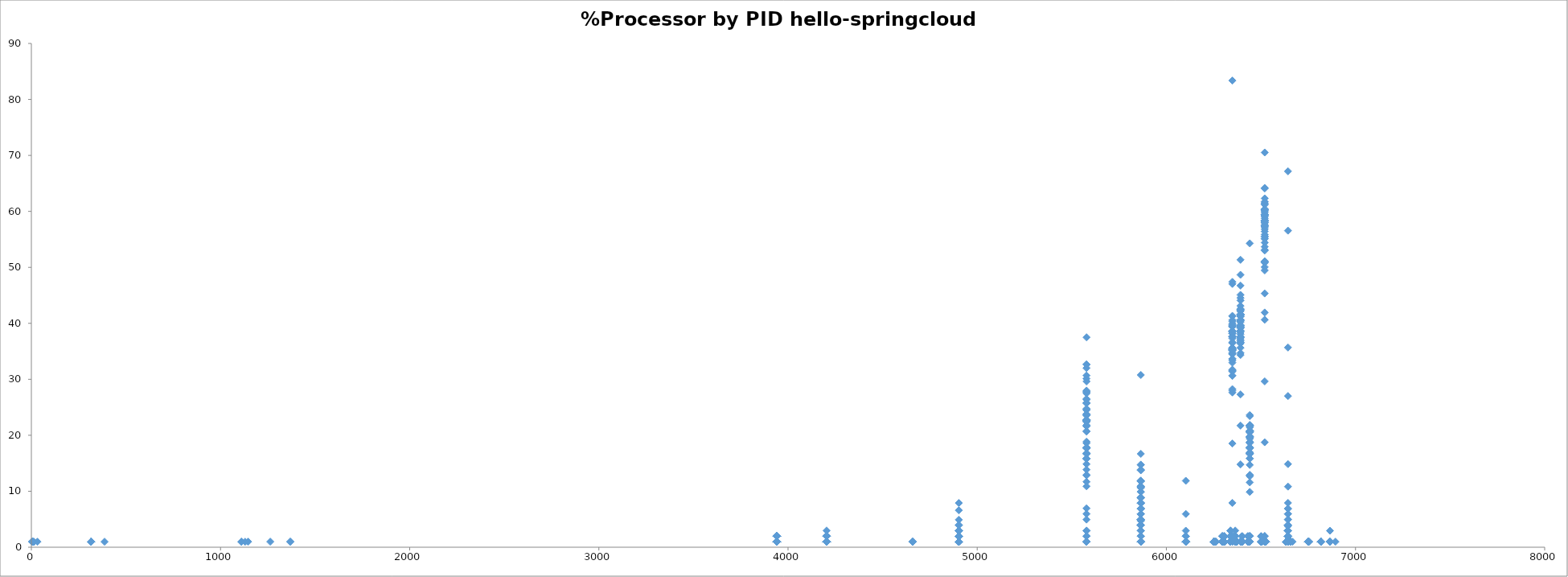
| Category | %CPU |
|---|---|
| 6865.0 | 2.95 |
| 6865.0 | 0.99 |
| 6865.0 | 0.99 |
| 3941.0 | 0.99 |
| 3941.0 | 0.99 |
| 3941.0 | 0.99 |
| 3941.0 | 0.99 |
| 3941.0 | 0.98 |
| 3941.0 | 0.99 |
| 3941.0 | 0.99 |
| 3941.0 | 0.96 |
| 3941.0 | 1.98 |
| 3941.0 | 0.98 |
| 3941.0 | 0.98 |
| 3941.0 | 0.98 |
| 3941.0 | 1.96 |
| 3941.0 | 0.98 |
| 3941.0 | 1.95 |
| 3941.0 | 1.98 |
| 3941.0 | 1.97 |
| 3941.0 | 0.98 |
| 3941.0 | 0.99 |
| 3941.0 | 0.99 |
| 3941.0 | 0.99 |
| 3941.0 | 1.98 |
| 3941.0 | 0.98 |
| 3941.0 | 0.99 |
| 3941.0 | 0.99 |
| 3941.0 | 1.96 |
| 3941.0 | 1.98 |
| 3941.0 | 1.97 |
| 3941.0 | 0.99 |
| 3941.0 | 1.97 |
| 3941.0 | 0.98 |
| 3941.0 | 1.98 |
| 3941.0 | 1.97 |
| 3941.0 | 0.97 |
| 3941.0 | 0.99 |
| 3941.0 | 1.97 |
| 3941.0 | 0.99 |
| 3941.0 | 0.99 |
| 3941.0 | 0.99 |
| 3941.0 | 0.98 |
| 3941.0 | 0.98 |
| 3941.0 | 1.98 |
| 3941.0 | 0.99 |
| 3941.0 | 1.97 |
| 3941.0 | 0.99 |
| 3941.0 | 1.94 |
| 3941.0 | 0.99 |
| 3941.0 | 1.98 |
| 3941.0 | 0.99 |
| 3941.0 | 0.99 |
| 3941.0 | 0.99 |
| 3941.0 | 0.99 |
| 3941.0 | 1.98 |
| 3941.0 | 0.99 |
| 3941.0 | 0.99 |
| 3941.0 | 1.98 |
| 3941.0 | 0.99 |
| 3941.0 | 0.99 |
| 3941.0 | 1.99 |
| 3941.0 | 0.99 |
| 3941.0 | 0.99 |
| 3941.0 | 1.99 |
| 3941.0 | 1.99 |
| 3941.0 | 0.99 |
| 3941.0 | 0.99 |
| 3941.0 | 0.99 |
| 3941.0 | 1.99 |
| 1130.0 | 0.98 |
| 6402.0 | 0.99 |
| 6402.0 | 0.99 |
| 6402.0 | 0.99 |
| 6402.0 | 0.98 |
| 6402.0 | 0.98 |
| 6306.0 | 0.98 |
| 6399.0 | 1.96 |
| 6306.0 | 0.98 |
| 6399.0 | 0.98 |
| 6402.0 | 0.98 |
| 6526.0 | 0.98 |
| 6306.0 | 0.98 |
| 6306.0 | 1.96 |
| 6399.0 | 0.98 |
| 6402.0 | 0.98 |
| 6399.0 | 0.98 |
| 6402.0 | 0.98 |
| 6306.0 | 0.99 |
| 6399.0 | 0.98 |
| 6402.0 | 0.98 |
| 6526.0 | 0.98 |
| 6306.0 | 0.98 |
| 6399.0 | 0.98 |
| 6402.0 | 0.98 |
| 6399.0 | 0.98 |
| 6667.0 | 0.98 |
| 6306.0 | 0.99 |
| 6306.0 | 0.99 |
| 6399.0 | 0.99 |
| 6402.0 | 0.99 |
| 6306.0 | 0.99 |
| 6399.0 | 0.99 |
| 6526.0 | 0.99 |
| 6402.0 | 0.99 |
| 6306.0 | 0.98 |
| 6399.0 | 0.98 |
| 6402.0 | 0.98 |
| 6306.0 | 0.99 |
| 6306.0 | 0.99 |
| 6399.0 | 0.99 |
| 6399.0 | 0.99 |
| 6402.0 | 0.99 |
| 6306.0 | 1.98 |
| 6399.0 | 0.99 |
| 6402.0 | 0.99 |
| 6399.0 | 0.99 |
| 6306.0 | 0.99 |
| 6399.0 | 0.99 |
| 6306.0 | 0.99 |
| 6402.0 | 0.99 |
| 6526.0 | 0.99 |
| 6306.0 | 0.99 |
| 6399.0 | 0.99 |
| 6402.0 | 0.99 |
| 6306.0 | 0.98 |
| 6399.0 | 0.98 |
| 6402.0 | 0.98 |
| 6526.0 | 0.98 |
| 6306.0 | 1.88 |
| 6399.0 | 0.94 |
| 6402.0 | 0.99 |
| 6306.0 | 0.99 |
| 6399.0 | 0.99 |
| 6402.0 | 0.99 |
| 6526.0 | 0.99 |
| 6306.0 | 0.97 |
| 6399.0 | 0.97 |
| 6306.0 | 0.99 |
| 6399.0 | 0.99 |
| 6402.0 | 0.99 |
| 6306.0 | 0.98 |
| 6399.0 | 0.98 |
| 6402.0 | 0.98 |
| 6306.0 | 0.98 |
| 6399.0 | 0.98 |
| 6399.0 | 0.99 |
| 6402.0 | 0.99 |
| 6306.0 | 0.99 |
| 6306.0 | 0.99 |
| 6399.0 | 0.99 |
| 6402.0 | 0.99 |
| 6399.0 | 0.98 |
| 6402.0 | 0.98 |
| 6306.0 | 0.98 |
| 6399.0 | 0.98 |
| 6526.0 | 0.98 |
| 6306.0 | 0.99 |
| 6399.0 | 0.99 |
| 6306.0 | 0.99 |
| 6399.0 | 0.99 |
| 6402.0 | 0.99 |
| 6402.0 | 0.98 |
| 6306.0 | 0.99 |
| 6399.0 | 0.99 |
| 6526.0 | 0.99 |
| 6306.0 | 1.98 |
| 6399.0 | 0.99 |
| 6402.0 | 0.99 |
| 6306.0 | 0.97 |
| 6399.0 | 0.97 |
| 6402.0 | 0.97 |
| 6306.0 | 0.99 |
| 6399.0 | 0.99 |
| 6402.0 | 0.99 |
| 6306.0 | 0.99 |
| 6399.0 | 0.99 |
| 6306.0 | 0.99 |
| 6399.0 | 0.99 |
| 6306.0 | 0.99 |
| 6399.0 | 0.99 |
| 6402.0 | 1.97 |
| 6526.0 | 0.99 |
| 6399.0 | 0.99 |
| 6402.0 | 0.99 |
| 6306.0 | 0.99 |
| 6261.0 | 0.99 |
| 6261.0 | 0.99 |
| 6261.0 | 0.99 |
| 1110.0 | 0.98 |
| 1111.0 | 0.99 |
| 5865.0 | 1.99 |
| 6643.0 | 0.99 |
| 4903.0 | 0.99 |
| 5578.0 | 0.99 |
| 5865.0 | 0.99 |
| 6349.0 | 0.99 |
| 6520.0 | 0.99 |
| 4903.0 | 0.99 |
| 5865.0 | 0.99 |
| 6349.0 | 39.73 |
| 6392.0 | 48.67 |
| 6441.0 | 12.91 |
| 6520.0 | 70.52 |
| 6643.0 | 4.97 |
| 4903.0 | 0.99 |
| 5578.0 | 4.94 |
| 5865.0 | 0.99 |
| 6349.0 | 47.4 |
| 6392.0 | 51.35 |
| 6441.0 | 16.79 |
| 6520.0 | 64.19 |
| 6643.0 | 6.91 |
| 4903.0 | 1.96 |
| 5578.0 | 2.94 |
| 5865.0 | 10.78 |
| 6349.0 | 47.04 |
| 6392.0 | 45.08 |
| 6441.0 | 18.62 |
| 6520.0 | 61.74 |
| 6643.0 | 3.92 |
| 4903.0 | 1.98 |
| 5578.0 | 14.85 |
| 5865.0 | 10.89 |
| 6349.0 | 38.6 |
| 6392.0 | 39.59 |
| 6441.0 | 15.84 |
| 6520.0 | 56.41 |
| 6643.0 | 14.85 |
| 4903.0 | 1.98 |
| 5578.0 | 23.79 |
| 5865.0 | 9.91 |
| 6349.0 | 31.72 |
| 6392.0 | 34.69 |
| 6441.0 | 12.89 |
| 6520.0 | 40.64 |
| 6643.0 | 35.68 |
| 4903.0 | 1.93 |
| 5578.0 | 27.98 |
| 5865.0 | 10.61 |
| 6349.0 | 27.98 |
| 6392.0 | 37.62 |
| 6441.0 | 11.58 |
| 6520.0 | 45.34 |
| 6643.0 | 27.01 |
| 4903.0 | 2.98 |
| 5578.0 | 25.8 |
| 5865.0 | 10.91 |
| 6349.0 | 37.7 |
| 6392.0 | 38.69 |
| 6441.0 | 15.87 |
| 6520.0 | 55.56 |
| 6643.0 | 1.98 |
| 4659.0 | 0.98 |
| 4903.0 | 4.91 |
| 5578.0 | 17.67 |
| 5865.0 | 13.74 |
| 6349.0 | 37.3 |
| 6392.0 | 41.23 |
| 6441.0 | 16.69 |
| 6520.0 | 53.01 |
| 6643.0 | 6.87 |
| 4903.0 | 1.96 |
| 5578.0 | 16.66 |
| 5865.0 | 14.7 |
| 6349.0 | 38.21 |
| 6392.0 | 44.09 |
| 6441.0 | 19.6 |
| 6520.0 | 50.95 |
| 6643.0 | 3.92 |
| 4903.0 | 1.96 |
| 5578.0 | 22.6 |
| 5865.0 | 7.86 |
| 6349.0 | 41.26 |
| 6392.0 | 41.26 |
| 6441.0 | 19.65 |
| 6520.0 | 51.09 |
| 6643.0 | 1.96 |
| 4903.0 | 1.96 |
| 5578.0 | 26.5 |
| 5865.0 | 8.83 |
| 6349.0 | 35.33 |
| 6392.0 | 40.24 |
| 6441.0 | 17.67 |
| 6520.0 | 51.03 |
| 6643.0 | 3.93 |
| 4903.0 | 0.98 |
| 5578.0 | 16.73 |
| 5865.0 | 13.78 |
| 6349.0 | 41.33 |
| 6392.0 | 37.39 |
| 6441.0 | 19.68 |
| 6520.0 | 55.1 |
| 6643.0 | 1.97 |
| 4903.0 | 1.96 |
| 5578.0 | 27.48 |
| 5865.0 | 16.68 |
| 6349.0 | 31.4 |
| 6392.0 | 34.35 |
| 6441.0 | 20.61 |
| 6520.0 | 50.05 |
| 6643.0 | 2.94 |
| 4903.0 | 0.98 |
| 5578.0 | 22.45 |
| 5865.0 | 10.74 |
| 6349.0 | 35.14 |
| 6392.0 | 37.09 |
| 6441.0 | 20.5 |
| 6520.0 | 53.68 |
| 6643.0 | 0.98 |
| 4659.0 | 0.98 |
| 4903.0 | 1.97 |
| 5578.0 | 17.71 |
| 5865.0 | 14.76 |
| 6349.0 | 35.42 |
| 6392.0 | 36.4 |
| 6441.0 | 23.61 |
| 6520.0 | 53.13 |
| 6643.0 | 2.95 |
| 4903.0 | 2.97 |
| 5578.0 | 15.83 |
| 5865.0 | 7.91 |
| 6349.0 | 37.59 |
| 6392.0 | 36.6 |
| 6441.0 | 20.77 |
| 6520.0 | 60.33 |
| 6643.0 | 7.91 |
| 4903.0 | 3.94 |
| 5578.0 | 22.64 |
| 5865.0 | 7.87 |
| 6349.0 | 31.5 |
| 6392.0 | 39.37 |
| 6441.0 | 21.65 |
| 6520.0 | 55.12 |
| 6643.0 | 4.92 |
| 4903.0 | 1.97 |
| 5578.0 | 16.73 |
| 5865.0 | 7.87 |
| 6349.0 | 40.34 |
| 6392.0 | 39.35 |
| 6441.0 | 21.64 |
| 6520.0 | 58.05 |
| 6643.0 | 1.97 |
| 4903.0 | 0.98 |
| 5578.0 | 26.36 |
| 5865.0 | 4.88 |
| 6349.0 | 35.15 |
| 6392.0 | 38.07 |
| 6441.0 | 23.43 |
| 6520.0 | 57.6 |
| 6643.0 | 1.95 |
| 4903.0 | 1.97 |
| 5578.0 | 23.65 |
| 5865.0 | 6.9 |
| 6349.0 | 39.42 |
| 6392.0 | 37.45 |
| 6441.0 | 16.75 |
| 6520.0 | 60.12 |
| 6643.0 | 0.99 |
| 4903.0 | 1.98 |
| 5578.0 | 32.65 |
| 5865.0 | 11.87 |
| 6349.0 | 30.67 |
| 6392.0 | 37.59 |
| 6441.0 | 17.81 |
| 6520.0 | 49.46 |
| 6643.0 | 3.96 |
| 4903.0 | 0.99 |
| 5578.0 | 32.66 |
| 5865.0 | 7.92 |
| 6349.0 | 34.64 |
| 6392.0 | 35.63 |
| 6441.0 | 19.79 |
| 6520.0 | 55.42 |
| 6643.0 | 0.99 |
| 4903.0 | 2.97 |
| 5578.0 | 15.85 |
| 5865.0 | 11.89 |
| 6349.0 | 37.65 |
| 6392.0 | 40.62 |
| 6441.0 | 20.8 |
| 6520.0 | 59.44 |
| 6643.0 | 2.97 |
| 4903.0 | 1.96 |
| 5578.0 | 18.6 |
| 5865.0 | 6.85 |
| 6349.0 | 38.19 |
| 6392.0 | 39.17 |
| 6441.0 | 20.56 |
| 6520.0 | 58.75 |
| 6643.0 | 1.96 |
| 4903.0 | 1.98 |
| 5578.0 | 21.81 |
| 5865.0 | 4.96 |
| 6349.0 | 37.67 |
| 6392.0 | 41.63 |
| 6441.0 | 21.81 |
| 6520.0 | 59.47 |
| 6643.0 | 1.98 |
| 4903.0 | 1.97 |
| 5578.0 | 29.62 |
| 5865.0 | 4.94 |
| 6349.0 | 31.6 |
| 6392.0 | 37.52 |
| 6441.0 | 18.76 |
| 6520.0 | 58.26 |
| 6643.0 | 2.96 |
| 4903.0 | 0.98 |
| 5578.0 | 23.53 |
| 5865.0 | 2.94 |
| 6349.0 | 35.3 |
| 6392.0 | 42.16 |
| 6441.0 | 20.59 |
| 6520.0 | 59.81 |
| 6643.0 | 1.96 |
| 4903.0 | 1.98 |
| 5578.0 | 25.73 |
| 5865.0 | 6.93 |
| 6349.0 | 33.65 |
| 6392.0 | 40.58 |
| 6441.0 | 19.79 |
| 6520.0 | 59.38 |
| 6643.0 | 0.99 |
| 4903.0 | 1.98 |
| 5578.0 | 24.74 |
| 5865.0 | 3.96 |
| 6349.0 | 35.62 |
| 6392.0 | 41.56 |
| 6441.0 | 18.8 |
| 6520.0 | 59.37 |
| 6643.0 | 2.97 |
| 4903.0 | 0.99 |
| 5578.0 | 18.85 |
| 5865.0 | 5.95 |
| 6349.0 | 34.72 |
| 6392.0 | 39.69 |
| 6441.0 | 21.83 |
| 6520.0 | 61.51 |
| 6643.0 | 5.95 |
| 4903.0 | 0.99 |
| 5578.0 | 12.83 |
| 5865.0 | 8.88 |
| 6349.0 | 38.5 |
| 6392.0 | 39.49 |
| 6441.0 | 21.72 |
| 6520.0 | 59.23 |
| 6643.0 | 1.97 |
| 4903.0 | 1.98 |
| 5578.0 | 15.84 |
| 5865.0 | 4.95 |
| 6349.0 | 40.59 |
| 6392.0 | 40.59 |
| 6441.0 | 21.78 |
| 6520.0 | 60.39 |
| 6643.0 | 2.97 |
| 4903.0 | 0.99 |
| 5578.0 | 17.79 |
| 5865.0 | 7.91 |
| 6349.0 | 38.56 |
| 6392.0 | 42.51 |
| 6441.0 | 20.76 |
| 6520.0 | 58.33 |
| 6643.0 | 1.98 |
| 4903.0 | 0.99 |
| 5578.0 | 22.7 |
| 5865.0 | 3.95 |
| 6349.0 | 34.54 |
| 6392.0 | 41.45 |
| 6441.0 | 20.73 |
| 6520.0 | 61.19 |
| 6643.0 | 1.97 |
| 4903.0 | 2.95 |
| 5578.0 | 24.62 |
| 5865.0 | 5.91 |
| 6349.0 | 35.45 |
| 6392.0 | 38.4 |
| 6441.0 | 21.66 |
| 6520.0 | 59.08 |
| 6643.0 | 10.83 |
| 4903.0 | 6.59 |
| 5578.0 | 30.12 |
| 5865.0 | 4.71 |
| 6349.0 | 28.24 |
| 6392.0 | 38.59 |
| 6441.0 | 16.94 |
| 6520.0 | 50.83 |
| 6643.0 | 3.76 |
| 4903.0 | 1.98 |
| 5578.0 | 22.77 |
| 5865.0 | 4.95 |
| 6349.0 | 33.66 |
| 6392.0 | 44.54 |
| 6441.0 | 17.82 |
| 6520.0 | 59.39 |
| 6643.0 | 0.99 |
| 4903.0 | 1.97 |
| 5578.0 | 15.78 |
| 5865.0 | 5.92 |
| 6349.0 | 36.49 |
| 6392.0 | 41.42 |
| 6441.0 | 20.71 |
| 6520.0 | 64.1 |
| 6643.0 | 1.97 |
| 4903.0 | 0.97 |
| 5578.0 | 11.69 |
| 5865.0 | 3.9 |
| 6349.0 | 39.93 |
| 6392.0 | 46.74 |
| 6441.0 | 21.42 |
| 6520.0 | 62.32 |
| 6643.0 | 1.95 |
| 4903.0 | 2.97 |
| 5578.0 | 23.75 |
| 5865.0 | 4.95 |
| 6349.0 | 37.6 |
| 6392.0 | 41.56 |
| 6441.0 | 17.81 |
| 6520.0 | 57.39 |
| 6643.0 | 1.98 |
| 4903.0 | 1.97 |
| 5578.0 | 21.68 |
| 5865.0 | 8.87 |
| 6349.0 | 34.48 |
| 6392.0 | 40.4 |
| 6441.0 | 17.73 |
| 6520.0 | 60.1 |
| 6643.0 | 0.99 |
| 4903.0 | 0.98 |
| 5578.0 | 20.67 |
| 5865.0 | 6.89 |
| 6349.0 | 39.37 |
| 6392.0 | 42.33 |
| 6441.0 | 19.69 |
| 6520.0 | 58.07 |
| 6643.0 | 1.97 |
| 4903.0 | 1.96 |
| 5578.0 | 21.61 |
| 5865.0 | 11.79 |
| 6349.0 | 33.39 |
| 6392.0 | 41.25 |
| 6441.0 | 16.7 |
| 6520.0 | 57.95 |
| 6643.0 | 0.98 |
| 4903.0 | 1.97 |
| 5578.0 | 17.77 |
| 5865.0 | 8.89 |
| 6349.0 | 39.49 |
| 6392.0 | 42.45 |
| 6441.0 | 17.77 |
| 6520.0 | 58.25 |
| 6643.0 | 2.96 |
| 4903.0 | 1.98 |
| 5578.0 | 17.81 |
| 5865.0 | 8.91 |
| 6349.0 | 39.58 |
| 6392.0 | 41.56 |
| 6441.0 | 18.8 |
| 6520.0 | 58.39 |
| 6643.0 | 1.98 |
| 4659.0 | 0.99 |
| 4903.0 | 0.99 |
| 5578.0 | 22.76 |
| 5865.0 | 10.89 |
| 6349.0 | 33.65 |
| 6392.0 | 41.56 |
| 6441.0 | 16.82 |
| 6520.0 | 57.4 |
| 6643.0 | 2.97 |
| 4903.0 | 0.98 |
| 5578.0 | 22.54 |
| 5865.0 | 11.76 |
| 6349.0 | 35.28 |
| 6392.0 | 39.2 |
| 6441.0 | 16.66 |
| 6520.0 | 56.83 |
| 6643.0 | 3.92 |
| 4903.0 | 0.98 |
| 5578.0 | 24.5 |
| 5865.0 | 4.9 |
| 6349.0 | 38.22 |
| 6392.0 | 43.12 |
| 6441.0 | 14.7 |
| 6520.0 | 55.86 |
| 6643.0 | 3.92 |
| 4903.0 | 1.98 |
| 5578.0 | 25.73 |
| 5865.0 | 3.96 |
| 6349.0 | 38.59 |
| 6392.0 | 39.58 |
| 6441.0 | 17.81 |
| 6520.0 | 59.37 |
| 6643.0 | 2.97 |
| 4903.0 | 2.96 |
| 5578.0 | 20.74 |
| 5865.0 | 6.91 |
| 6349.0 | 30.62 |
| 6392.0 | 21.73 |
| 6441.0 | 9.88 |
| 6520.0 | 29.63 |
| 6643.0 | 67.16 |
| 4903.0 | 0.98 |
| 5578.0 | 22.43 |
| 5865.0 | 8.78 |
| 6349.0 | 18.53 |
| 6392.0 | 27.3 |
| 6441.0 | 12.68 |
| 6520.0 | 41.93 |
| 6643.0 | 56.56 |
| 4903.0 | 1.97 |
| 5578.0 | 22.69 |
| 5865.0 | 7.89 |
| 6349.0 | 36.5 |
| 6392.0 | 40.45 |
| 6441.0 | 20.72 |
| 6520.0 | 57.22 |
| 6643.0 | 2.96 |
| 4903.0 | 0.99 |
| 5578.0 | 10.89 |
| 5865.0 | 11.88 |
| 6349.0 | 38.6 |
| 6392.0 | 40.58 |
| 6441.0 | 19.79 |
| 6520.0 | 61.36 |
| 6643.0 | 1.98 |
| 4659.0 | 0.99 |
| 4903.0 | 0.99 |
| 5578.0 | 22.77 |
| 5865.0 | 9.9 |
| 6349.0 | 36.62 |
| 6392.0 | 38.6 |
| 6441.0 | 16.83 |
| 6520.0 | 59.39 |
| 6643.0 | 5.94 |
| 4903.0 | 1.94 |
| 5578.0 | 32.01 |
| 5865.0 | 4.85 |
| 6349.0 | 32.98 |
| 6392.0 | 36.86 |
| 6441.0 | 19.4 |
| 6520.0 | 57.23 |
| 6643.0 | 1.94 |
| 4903.0 | 0.99 |
| 5578.0 | 27.71 |
| 5865.0 | 3.96 |
| 6349.0 | 35.62 |
| 6392.0 | 36.61 |
| 6441.0 | 20.78 |
| 6520.0 | 54.42 |
| 6643.0 | 1.98 |
| 4903.0 | 0.99 |
| 5578.0 | 16.81 |
| 5865.0 | 3.96 |
| 6349.0 | 38.57 |
| 6392.0 | 39.56 |
| 6441.0 | 16.81 |
| 6520.0 | 60.32 |
| 6643.0 | 0.99 |
| 4903.0 | 0.99 |
| 5578.0 | 17.82 |
| 5865.0 | 4.95 |
| 6349.0 | 38.61 |
| 6392.0 | 42.57 |
| 6441.0 | 20.79 |
| 6520.0 | 58.41 |
| 6643.0 | 3.96 |
| 4903.0 | 2.97 |
| 5578.0 | 13.86 |
| 5865.0 | 13.86 |
| 6349.0 | 35.65 |
| 6392.0 | 41.59 |
| 6441.0 | 17.82 |
| 6520.0 | 60.4 |
| 6643.0 | 1.98 |
| 4903.0 | 7.9 |
| 5578.0 | 37.5 |
| 5865.0 | 4.93 |
| 6349.0 | 27.64 |
| 6392.0 | 14.8 |
| 6441.0 | 54.28 |
| 6520.0 | 18.75 |
| 4903.0 | 1.98 |
| 5578.0 | 27.79 |
| 5865.0 | 30.77 |
| 6349.0 | 83.37 |
| 6643.0 | 0.99 |
| 4903.0 | 3.96 |
| 5578.0 | 30.68 |
| 5865.0 | 3.96 |
| 6349.0 | 7.92 |
| 6520.0 | 0.99 |
| 6643.0 | 0.99 |
| 4903.0 | 0.99 |
| 5578.0 | 2.97 |
| 5865.0 | 1.98 |
| 4903.0 | 1.99 |
| 5865.0 | 0.99 |
| 6349.0 | 0.99 |
| 6441.0 | 0.99 |
| 6520.0 | 0.99 |
| 6643.0 | 0.99 |
| 5578.0 | 1.99 |
| 5865.0 | 0.99 |
| 6392.0 | 0.99 |
| 6520.0 | 1.99 |
| 6643.0 | 1.99 |
| 4903.0 | 1.98 |
| 5578.0 | 1.98 |
| 5865.0 | 0.99 |
| 6441.0 | 1.98 |
| 6520.0 | 0.99 |
| 4903.0 | 0.99 |
| 5865.0 | 2.98 |
| 6392.0 | 0.99 |
| 6441.0 | 0.99 |
| 6520.0 | 1.99 |
| 6643.0 | 1.99 |
| 5578.0 | 0.99 |
| 5865.0 | 1.99 |
| 6349.0 | 0.99 |
| 6643.0 | 0.99 |
| 4903.0 | 1.99 |
| 5865.0 | 0.99 |
| 6441.0 | 1.99 |
| 6520.0 | 0.99 |
| 6643.0 | 1.99 |
| 4903.0 | 1.99 |
| 5578.0 | 0.99 |
| 5865.0 | 0.99 |
| 6520.0 | 0.99 |
| 6643.0 | 0.99 |
| 4903.0 | 0.99 |
| 5865.0 | 0.99 |
| 6349.0 | 0.99 |
| 6441.0 | 0.99 |
| 6520.0 | 0.99 |
| 4903.0 | 0.99 |
| 5578.0 | 0.99 |
| 5865.0 | 2.98 |
| 6643.0 | 0.99 |
| 4903.0 | 1.99 |
| 5578.0 | 0.99 |
| 5865.0 | 0.99 |
| 6392.0 | 0.99 |
| 6441.0 | 0.99 |
| 4903.0 | 1.99 |
| 5865.0 | 0.99 |
| 6520.0 | 0.99 |
| 6643.0 | 0.99 |
| 5578.0 | 12.92 |
| 5865.0 | 0.99 |
| 6349.0 | 1.99 |
| 6441.0 | 0.99 |
| 6643.0 | 0.99 |
| 4903.0 | 1.99 |
| 5578.0 | 6.95 |
| 5865.0 | 0.99 |
| 6392.0 | 0.99 |
| 6441.0 | 0.99 |
| 6520.0 | 0.99 |
| 6643.0 | 0.99 |
| 4903.0 | 0.99 |
| 5578.0 | 5.96 |
| 5865.0 | 3.97 |
| 6441.0 | 1.99 |
| 6520.0 | 0.99 |
| 6643.0 | 0.99 |
| 316.0 | 0.99 |
| 316.0 | 0.98 |
| 316.0 | 0.99 |
| 316.0 | 0.98 |
| 316.0 | 0.98 |
| 316.0 | 0.99 |
| 316.0 | 0.99 |
| 316.0 | 0.97 |
| 3.0 | 0.99 |
| 13.0 | 0.98 |
| 13.0 | 0.94 |
| 1369.0 | 0.99 |
| 1369.0 | 0.99 |
| 32.0 | 0.98 |
| 6755.0 | 0.99 |
| 6751.0 | 0.99 |
| 6751.0 | 0.99 |
| 6751.0 | 0.98 |
| 6751.0 | 0.99 |
| 6751.0 | 0.98 |
| 6751.0 | 0.98 |
| 6751.0 | 0.98 |
| 6751.0 | 0.98 |
| 6751.0 | 0.99 |
| 6751.0 | 0.98 |
| 6751.0 | 0.98 |
| 6751.0 | 0.99 |
| 6751.0 | 0.98 |
| 6751.0 | 0.99 |
| 6751.0 | 0.99 |
| 6751.0 | 0.99 |
| 6751.0 | 0.99 |
| 6751.0 | 0.99 |
| 6751.0 | 0.98 |
| 6751.0 | 0.94 |
| 6751.0 | 0.99 |
| 6751.0 | 0.99 |
| 6751.0 | 0.98 |
| 6751.0 | 0.99 |
| 6751.0 | 0.98 |
| 6751.0 | 0.99 |
| 6751.0 | 0.99 |
| 6751.0 | 0.99 |
| 6751.0 | 0.97 |
| 6751.0 | 0.99 |
| 6751.0 | 0.99 |
| 6751.0 | 0.99 |
| 6751.0 | 0.99 |
| 6751.0 | 0.99 |
| 6751.0 | 0.99 |
| 6751.0 | 0.99 |
| 6751.0 | 0.99 |
| 6751.0 | 0.99 |
| 6751.0 | 0.99 |
| 6103.0 | 0.99 |
| 6103.0 | 0.99 |
| 6103.0 | 0.99 |
| 6103.0 | 1.98 |
| 6103.0 | 0.98 |
| 6103.0 | 0.98 |
| 6103.0 | 2.95 |
| 6103.0 | 0.99 |
| 6103.0 | 0.99 |
| 6103.0 | 0.98 |
| 6103.0 | 0.99 |
| 6103.0 | 0.98 |
| 6103.0 | 0.99 |
| 6103.0 | 0.99 |
| 6103.0 | 0.99 |
| 6103.0 | 0.94 |
| 6103.0 | 0.97 |
| 6103.0 | 1.97 |
| 6103.0 | 1.98 |
| 6103.0 | 0.99 |
| 6103.0 | 0.99 |
| 6103.0 | 5.94 |
| 6103.0 | 11.87 |
| 6103.0 | 0.99 |
| 6103.0 | 0.99 |
| 6103.0 | 0.99 |
| 6103.0 | 0.99 |
| 6103.0 | 0.99 |
| 6103.0 | 0.99 |
| 6103.0 | 0.99 |
| 6251.0 | 0.99 |
| 6371.0 | 0.99 |
| 6372.0 | 0.99 |
| 6431.0 | 0.99 |
| 4204.0 | 2.98 |
| 6251.0 | 0.99 |
| 6364.0 | 0.99 |
| 6633.0 | 0.99 |
| 6656.0 | 0.99 |
| 6296.0 | 0.99 |
| 6339.0 | 0.99 |
| 6501.0 | 1.99 |
| 6505.0 | 0.99 |
| 4204.0 | 0.99 |
| 6339.0 | 0.99 |
| 6364.0 | 0.99 |
| 4204.0 | 0.98 |
| 6251.0 | 0.98 |
| 6339.0 | 0.98 |
| 6364.0 | 0.98 |
| 6371.0 | 0.98 |
| 6372.0 | 0.98 |
| 6431.0 | 0.98 |
| 6656.0 | 0.98 |
| 4204.0 | 0.99 |
| 6296.0 | 0.99 |
| 6364.0 | 0.99 |
| 6501.0 | 0.99 |
| 6633.0 | 0.99 |
| 4204.0 | 0.99 |
| 6339.0 | 0.99 |
| 6364.0 | 0.99 |
| 6371.0 | 0.99 |
| 4204.0 | 0.96 |
| 6339.0 | 0.96 |
| 6364.0 | 0.96 |
| 6505.0 | 0.96 |
| 4204.0 | 0.99 |
| 6251.0 | 0.99 |
| 6339.0 | 0.99 |
| 6364.0 | 0.99 |
| 6656.0 | 0.99 |
| 6339.0 | 0.98 |
| 6364.0 | 0.98 |
| 6371.0 | 0.98 |
| 6431.0 | 1.96 |
| 6633.0 | 0.98 |
| 4204.0 | 0.98 |
| 6296.0 | 0.98 |
| 6339.0 | 1.96 |
| 6364.0 | 0.98 |
| 6372.0 | 0.98 |
| 6501.0 | 0.98 |
| 4204.0 | 1.96 |
| 6251.0 | 0.98 |
| 6339.0 | 0.98 |
| 6364.0 | 0.98 |
| 6501.0 | 0.98 |
| 4204.0 | 0.98 |
| 6296.0 | 0.98 |
| 6339.0 | 0.98 |
| 6364.0 | 0.98 |
| 6371.0 | 0.98 |
| 6431.0 | 0.98 |
| 6505.0 | 0.98 |
| 6633.0 | 0.98 |
| 4204.0 | 1.97 |
| 6339.0 | 1.97 |
| 6364.0 | 1.97 |
| 6501.0 | 0.98 |
| 6505.0 | 0.98 |
| 6656.0 | 0.98 |
| 6339.0 | 0.98 |
| 6364.0 | 1.96 |
| 6431.0 | 0.98 |
| 6656.0 | 0.98 |
| 4204.0 | 0.98 |
| 6251.0 | 0.98 |
| 6339.0 | 0.98 |
| 6364.0 | 0.98 |
| 6372.0 | 0.98 |
| 6431.0 | 0.98 |
| 6501.0 | 0.98 |
| 6339.0 | 0.98 |
| 6364.0 | 1.97 |
| 6633.0 | 0.98 |
| 4204.0 | 0.99 |
| 6296.0 | 0.99 |
| 6339.0 | 1.98 |
| 6371.0 | 0.99 |
| 6431.0 | 0.99 |
| 6501.0 | 0.99 |
| 6505.0 | 0.99 |
| 4204.0 | 0.98 |
| 6251.0 | 0.98 |
| 6339.0 | 0.98 |
| 6364.0 | 1.97 |
| 6372.0 | 0.98 |
| 6656.0 | 0.98 |
| 4204.0 | 0.98 |
| 6339.0 | 0.98 |
| 6364.0 | 1.97 |
| 6371.0 | 0.98 |
| 6431.0 | 0.98 |
| 4204.0 | 0.98 |
| 6339.0 | 1.95 |
| 6431.0 | 0.98 |
| 6501.0 | 0.98 |
| 6656.0 | 0.98 |
| 6251.0 | 0.99 |
| 6339.0 | 1.97 |
| 6364.0 | 1.97 |
| 6431.0 | 0.99 |
| 6633.0 | 0.99 |
| 4204.0 | 1.98 |
| 6296.0 | 1.98 |
| 6339.0 | 0.99 |
| 6364.0 | 1.98 |
| 6505.0 | 0.99 |
| 4204.0 | 0.99 |
| 6251.0 | 0.99 |
| 6339.0 | 0.99 |
| 6364.0 | 0.99 |
| 6371.0 | 0.99 |
| 6501.0 | 0.99 |
| 6633.0 | 0.99 |
| 4204.0 | 0.99 |
| 6339.0 | 1.98 |
| 6364.0 | 0.99 |
| 6372.0 | 0.99 |
| 6431.0 | 0.99 |
| 4204.0 | 0.98 |
| 6339.0 | 0.98 |
| 6364.0 | 0.98 |
| 6656.0 | 0.98 |
| 4204.0 | 0.99 |
| 6251.0 | 0.99 |
| 6339.0 | 0.99 |
| 6364.0 | 1.98 |
| 6431.0 | 0.99 |
| 6501.0 | 0.99 |
| 4204.0 | 0.99 |
| 6296.0 | 0.99 |
| 6339.0 | 0.99 |
| 6364.0 | 0.99 |
| 6371.0 | 0.99 |
| 6372.0 | 0.99 |
| 6501.0 | 0.99 |
| 6505.0 | 0.99 |
| 6296.0 | 0.98 |
| 6339.0 | 1.96 |
| 6364.0 | 1.96 |
| 6431.0 | 0.98 |
| 6251.0 | 0.99 |
| 6339.0 | 1.98 |
| 6364.0 | 0.99 |
| 6371.0 | 0.99 |
| 6372.0 | 0.99 |
| 6431.0 | 0.99 |
| 6656.0 | 0.99 |
| 4204.0 | 0.99 |
| 6296.0 | 0.99 |
| 6339.0 | 0.99 |
| 6364.0 | 1.98 |
| 6501.0 | 0.99 |
| 6633.0 | 0.99 |
| 4204.0 | 0.99 |
| 6339.0 | 1.98 |
| 6364.0 | 0.99 |
| 4204.0 | 1.97 |
| 6364.0 | 0.99 |
| 6431.0 | 0.99 |
| 6501.0 | 0.99 |
| 6505.0 | 0.99 |
| 6339.0 | 2.97 |
| 6364.0 | 1.98 |
| 6372.0 | 0.99 |
| 6431.0 | 0.99 |
| 4204.0 | 1.98 |
| 6339.0 | 0.99 |
| 6364.0 | 1.98 |
| 6371.0 | 0.99 |
| 6501.0 | 0.99 |
| 6633.0 | 0.99 |
| 6656.0 | 0.99 |
| 4204.0 | 0.99 |
| 6251.0 | 0.99 |
| 6339.0 | 0.99 |
| 6364.0 | 1.97 |
| 6431.0 | 0.99 |
| 6505.0 | 0.99 |
| 6339.0 | 0.98 |
| 6364.0 | 0.98 |
| 6371.0 | 0.98 |
| 6431.0 | 0.98 |
| 6633.0 | 0.98 |
| 4204.0 | 0.94 |
| 6251.0 | 0.94 |
| 6296.0 | 0.94 |
| 6339.0 | 1.88 |
| 6364.0 | 0.94 |
| 6501.0 | 0.94 |
| 6656.0 | 0.94 |
| 4204.0 | 1.98 |
| 6251.0 | 0.99 |
| 6296.0 | 0.99 |
| 6339.0 | 1.98 |
| 6364.0 | 1.98 |
| 6372.0 | 0.99 |
| 6431.0 | 0.99 |
| 6501.0 | 0.99 |
| 6505.0 | 0.99 |
| 6364.0 | 1.97 |
| 6371.0 | 0.99 |
| 6372.0 | 0.99 |
| 6633.0 | 0.99 |
| 6656.0 | 0.99 |
| 6251.0 | 0.97 |
| 6339.0 | 2.92 |
| 6364.0 | 1.95 |
| 6431.0 | 1.95 |
| 6501.0 | 0.97 |
| 4204.0 | 0.99 |
| 6501.0 | 0.99 |
| 6633.0 | 0.99 |
| 4204.0 | 0.99 |
| 6296.0 | 0.99 |
| 6339.0 | 1.97 |
| 6364.0 | 1.97 |
| 6371.0 | 0.99 |
| 6431.0 | 0.99 |
| 6505.0 | 0.99 |
| 4204.0 | 0.98 |
| 6339.0 | 1.97 |
| 6364.0 | 1.97 |
| 6431.0 | 0.98 |
| 6501.0 | 0.98 |
| 4204.0 | 0.98 |
| 6339.0 | 1.96 |
| 6364.0 | 1.96 |
| 6656.0 | 0.98 |
| 4204.0 | 0.99 |
| 6251.0 | 0.99 |
| 6339.0 | 0.99 |
| 6364.0 | 0.99 |
| 6372.0 | 0.99 |
| 4204.0 | 0.99 |
| 6339.0 | 0.99 |
| 6364.0 | 1.98 |
| 6431.0 | 0.99 |
| 6501.0 | 0.99 |
| 6505.0 | 0.99 |
| 6633.0 | 0.99 |
| 6296.0 | 1.98 |
| 6339.0 | 1.98 |
| 6364.0 | 0.99 |
| 4204.0 | 0.98 |
| 6251.0 | 0.98 |
| 6339.0 | 1.96 |
| 6364.0 | 1.96 |
| 6431.0 | 0.98 |
| 6501.0 | 0.98 |
| 6656.0 | 0.98 |
| 4204.0 | 0.98 |
| 6339.0 | 1.96 |
| 6364.0 | 1.96 |
| 6371.0 | 0.98 |
| 6431.0 | 0.98 |
| 6633.0 | 0.98 |
| 4204.0 | 0.99 |
| 6339.0 | 1.98 |
| 6364.0 | 0.99 |
| 6372.0 | 0.99 |
| 6501.0 | 0.99 |
| 4204.0 | 0.99 |
| 6296.0 | 0.99 |
| 6364.0 | 0.99 |
| 6371.0 | 0.99 |
| 6505.0 | 0.99 |
| 6339.0 | 0.98 |
| 6364.0 | 0.98 |
| 4204.0 | 1.97 |
| 6251.0 | 0.99 |
| 6339.0 | 1.97 |
| 6364.0 | 1.97 |
| 6372.0 | 0.99 |
| 6431.0 | 1.97 |
| 6656.0 | 0.99 |
| 4204.0 | 0.99 |
| 6339.0 | 0.99 |
| 6364.0 | 1.98 |
| 6371.0 | 0.99 |
| 6431.0 | 0.99 |
| 6501.0 | 0.99 |
| 6633.0 | 0.99 |
| 6656.0 | 0.99 |
| 4204.0 | 0.99 |
| 6251.0 | 0.99 |
| 6339.0 | 1.98 |
| 6364.0 | 1.98 |
| 6431.0 | 0.99 |
| 4204.0 | 0.97 |
| 6251.0 | 0.97 |
| 6339.0 | 0.97 |
| 6364.0 | 0.97 |
| 6371.0 | 0.97 |
| 6501.0 | 1.94 |
| 6505.0 | 0.97 |
| 6364.0 | 0.99 |
| 6633.0 | 0.99 |
| 6656.0 | 0.99 |
| 4204.0 | 0.99 |
| 6296.0 | 0.99 |
| 6339.0 | 2.97 |
| 6364.0 | 0.99 |
| 6431.0 | 0.99 |
| 4204.0 | 0.99 |
| 6339.0 | 0.99 |
| 6364.0 | 2.97 |
| 6372.0 | 0.99 |
| 6501.0 | 0.99 |
| 4204.0 | 0.99 |
| 6251.0 | 0.99 |
| 6296.0 | 0.99 |
| 6339.0 | 1.98 |
| 6364.0 | 0.99 |
| 6431.0 | 0.99 |
| 6296.0 | 0.99 |
| 6501.0 | 0.99 |
| 6505.0 | 0.99 |
| 6656.0 | 0.99 |
| 4204.0 | 0.99 |
| 6633.0 | 0.99 |
| 4204.0 | 0.99 |
| 6251.0 | 0.99 |
| 6371.0 | 0.99 |
| 6431.0 | 0.99 |
| 4204.0 | 0.99 |
| 6364.0 | 0.99 |
| 6371.0 | 0.99 |
| 6372.0 | 0.99 |
| 6505.0 | 0.99 |
| 4204.0 | 1.99 |
| 6251.0 | 0.99 |
| 6633.0 | 0.99 |
| 6656.0 | 0.99 |
| 4204.0 | 0.99 |
| 6339.0 | 0.99 |
| 6501.0 | 0.99 |
| 4204.0 | 0.99 |
| 6339.0 | 0.99 |
| 6501.0 | 0.99 |
| 6633.0 | 0.99 |
| 4204.0 | 0.99 |
| 6296.0 | 0.99 |
| 6372.0 | 0.99 |
| 6431.0 | 0.99 |
| 6656.0 | 0.99 |
| 4204.0 | 0.99 |
| 6364.0 | 0.99 |
| 6371.0 | 0.99 |
| 6505.0 | 0.99 |
| 4204.0 | 0.99 |
| 6251.0 | 0.99 |
| 6339.0 | 0.99 |
| 6371.0 | 0.99 |
| 6372.0 | 0.99 |
| 6431.0 | 0.99 |
| 4204.0 | 0.99 |
| 6364.0 | 0.99 |
| 6501.0 | 0.99 |
| 6505.0 | 0.99 |
| 6633.0 | 0.99 |
| 4204.0 | 0.99 |
| 6296.0 | 0.99 |
| 6656.0 | 0.99 |
| 4204.0 | 0.99 |
| 6251.0 | 0.99 |
| 6339.0 | 0.99 |
| 6372.0 | 0.99 |
| 6431.0 | 0.99 |
| 6656.0 | 0.99 |
| 4204.0 | 1.99 |
| 6364.0 | 0.99 |
| 6371.0 | 0.99 |
| 6251.0 | 0.99 |
| 4204.0 | 0.99 |
| 6251.0 | 0.99 |
| 6296.0 | 1.99 |
| 6339.0 | 0.99 |
| 6364.0 | 0.99 |
| 6501.0 | 0.99 |
| 4204.0 | 1.99 |
| 6372.0 | 0.99 |
| 6431.0 | 0.99 |
| 6505.0 | 0.99 |
| 6633.0 | 0.99 |
| 6656.0 | 0.99 |
| 4204.0 | 0.99 |
| 6633.0 | 0.99 |
| 6656.0 | 0.99 |
| 7.0 | 0.96 |
| 7.0 | 0.98 |
| 7.0 | 0.99 |
| 7.0 | 0.99 |
| 7.0 | 0.99 |
| 7.0 | 0.98 |
| 7.0 | 0.99 |
| 7.0 | 0.99 |
| 1146.0 | 0.99 |
| 6864.0 | 0.99 |
| 6864.0 | 0.99 |
| 387.0 | 0.98 |
| 6894.0 | 0.99 |
| 1263.0 | 0.99 |
| 6817.0 | 0.96 |
| 6817.0 | 0.98 |
| 6817.0 | 0.98 |
| 6817.0 | 0.99 |
| 6817.0 | 0.99 |
| 6817.0 | 0.99 |
| 6817.0 | 0.99 |
| 6817.0 | 0.98 |
| 6817.0 | 0.99 |
| 6817.0 | 0.98 |
| 6817.0 | 0.99 |
| 6817.0 | 0.99 |
| 6817.0 | 0.97 |
| 6817.0 | 0.99 |